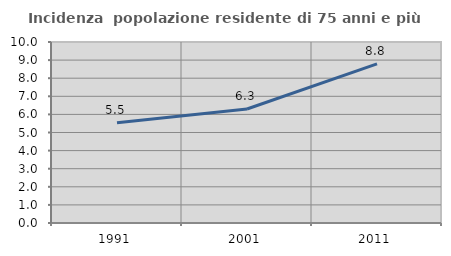
| Category | Incidenza  popolazione residente di 75 anni e più |
|---|---|
| 1991.0 | 5.54 |
| 2001.0 | 6.3 |
| 2011.0 | 8.79 |